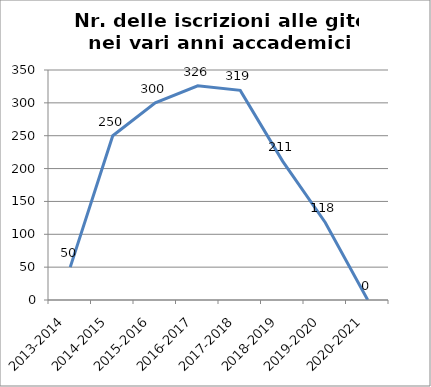
| Category | Nr. Iscrizioni alle Gite |
|---|---|
| 2013-2014 | 50 |
| 2014-2015 | 250 |
| 2015-2016 | 300 |
| 2016-2017 | 326 |
| 2017-2018 | 319 |
| 2018-2019 | 211 |
| 2019-2020 | 118 |
| 2020-2021 | 0 |